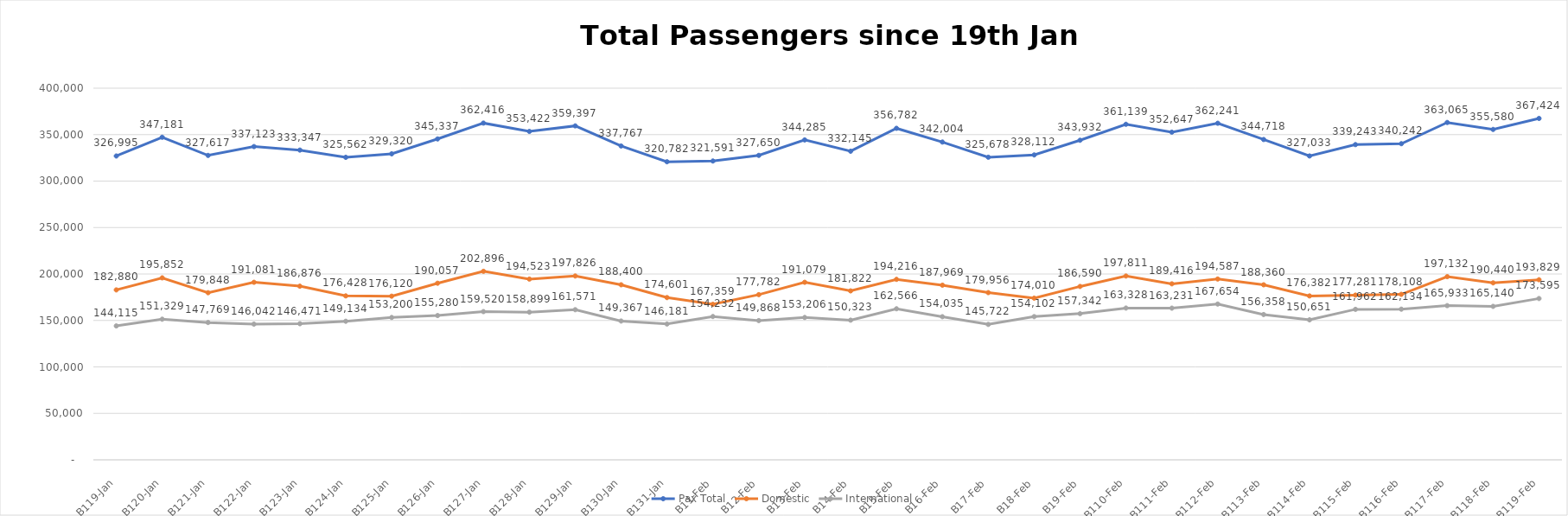
| Category | Pax Total |  Domestic  |  International  |
|---|---|---|---|
| 2023-01-19 | 326995 | 182880 | 144115 |
| 2023-01-20 | 347181 | 195852 | 151329 |
| 2023-01-21 | 327617 | 179848 | 147769 |
| 2023-01-22 | 337123 | 191081 | 146042 |
| 2023-01-23 | 333347 | 186876 | 146471 |
| 2023-01-24 | 325562 | 176428 | 149134 |
| 2023-01-25 | 329320 | 176120 | 153200 |
| 2023-01-26 | 345337 | 190057 | 155280 |
| 2023-01-27 | 362416 | 202896 | 159520 |
| 2023-01-28 | 353422 | 194523 | 158899 |
| 2023-01-29 | 359397 | 197826 | 161571 |
| 2023-01-30 | 337767 | 188400 | 149367 |
| 2023-01-31 | 320782 | 174601 | 146181 |
| 2023-02-01 | 321591 | 167359 | 154232 |
| 2023-02-02 | 327650 | 177782 | 149868 |
| 2023-02-03 | 344285 | 191079 | 153206 |
| 2023-02-04 | 332145 | 181822 | 150323 |
| 2023-02-05 | 356782 | 194216 | 162566 |
| 2023-02-06 | 342004 | 187969 | 154035 |
| 2023-02-07 | 325678 | 179956 | 145722 |
| 2023-02-08 | 328112 | 174010 | 154102 |
| 2023-02-09 | 343932 | 186590 | 157342 |
| 2023-02-10 | 361139 | 197811 | 163328 |
| 2023-02-11 | 352647 | 189416 | 163231 |
| 2023-02-12 | 362241 | 194587 | 167654 |
| 2023-02-13 | 344718 | 188360 | 156358 |
| 2023-02-14 | 327033 | 176382 | 150651 |
| 2023-02-15 | 339243 | 177281 | 161962 |
| 2023-02-16 | 340242 | 178108 | 162134 |
| 2023-02-17 | 363065 | 197132 | 165933 |
| 2023-02-18 | 355580 | 190440 | 165140 |
| 2023-02-19 | 367424 | 193829 | 173595 |